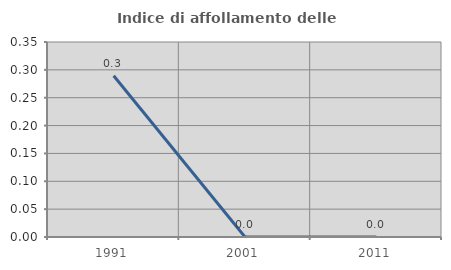
| Category | Indice di affollamento delle abitazioni  |
|---|---|
| 1991.0 | 0.289 |
| 2001.0 | 0 |
| 2011.0 | 0 |